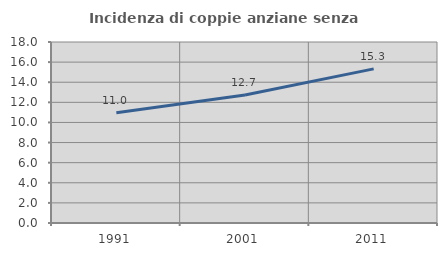
| Category | Incidenza di coppie anziane senza figli  |
|---|---|
| 1991.0 | 10.975 |
| 2001.0 | 12.736 |
| 2011.0 | 15.33 |